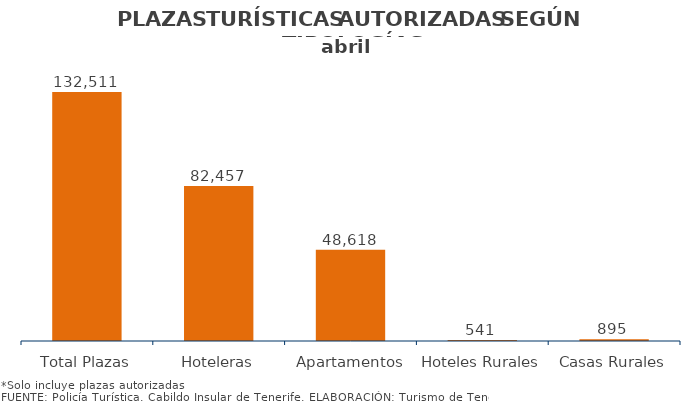
| Category | PLAZAS TURISTICAS AUTORIZADAS SEGÚN TIPOLOGÍA DEL ESTABLECIMIENTO.
Municipios e Isla abril 2014 |
|---|---|
| Total Plazas | 132511 |
| Hoteleras | 82457 |
| Apartamentos | 48618 |
| Hoteles Rurales | 541 |
| Casas Rurales | 895 |